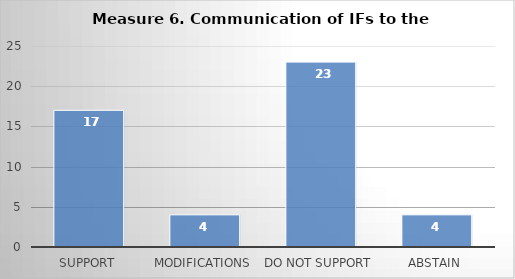
| Category | Series 0 |
|---|---|
| Support | 17 |
| Modifications | 4 |
| Do not support | 23 |
| Abstain | 4 |